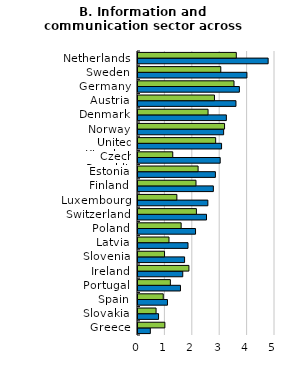
| Category | Average last 4 quarters | Average last 8 years |
|---|---|---|
| Greece | 0.45 | 0.981 |
| Slovakia | 0.75 | 0.659 |
| Spain | 1.075 | 0.922 |
| Portugal | 1.55 | 1.181 |
| Ireland | 1.633 | 1.858 |
| Slovenia | 1.7 | 0.969 |
| Latvia | 1.825 | 1.131 |
| Poland | 2.1 | 1.575 |
| Switzerland | 2.5 | 2.131 |
| Luxembourg | 2.55 | 1.419 |
| Finland | 2.75 | 2.117 |
| Estonia | 2.825 | 2.194 |
| Czech Republic | 3 | 1.269 |
| United Kingdom | 3.05 | 2.834 |
| Norway | 3.125 | 3.159 |
| Denmark | 3.225 | 2.557 |
| Austria | 3.575 | 2.791 |
| Germany | 3.7 | 3.504 |
| Sweden | 3.975 | 3.021 |
| Netherlands | 4.75 | 3.588 |